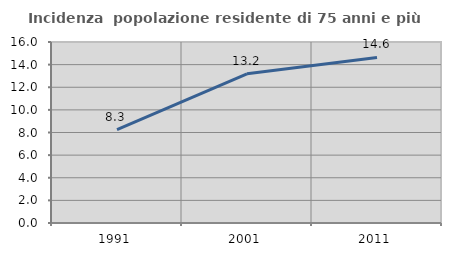
| Category | Incidenza  popolazione residente di 75 anni e più |
|---|---|
| 1991.0 | 8.261 |
| 2001.0 | 13.186 |
| 2011.0 | 14.632 |